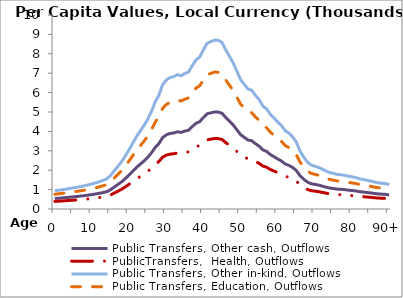
| Category | Public Transfers, Other cash, Outflows | PublicTransfers,  Health, Outflows | Public Transfers, Other in-kind, Outflows | Public Transfers, Education, Outflows |
|---|---|---|---|---|
| 0 | 539.202 | 391.473 | 937.989 | 760.378 |
|  | 555.87 | 403.574 | 966.984 | 783.882 |
| 2 | 572.537 | 415.675 | 995.978 | 807.386 |
| 3 | 589.205 | 427.776 | 1024.973 | 830.891 |
| 4 | 607.193 | 440.836 | 1056.265 | 856.258 |
| 5 | 626.052 | 454.528 | 1089.071 | 882.852 |
| 6 | 646.341 | 469.259 | 1124.367 | 911.464 |
| 7 | 668.012 | 484.992 | 1162.064 | 942.024 |
| 8 | 689.005 | 500.234 | 1198.585 | 971.629 |
| 9 | 714.708 | 518.894 | 1243.296 | 1007.874 |
| 10 | 743.777 | 539.999 | 1293.864 | 1048.867 |
| 11 | 775.064 | 562.715 | 1348.292 | 1092.988 |
| 12 | 810.653 | 588.553 | 1410.201 | 1143.175 |
| 13 | 849.215 | 616.55 | 1477.283 | 1197.554 |
| 14 | 893.287 | 648.547 | 1553.951 | 1259.705 |
| 15 | 995.519 | 722.77 | 1731.791 | 1403.871 |
| 16 | 1130.866 | 821.035 | 1967.24 | 1594.737 |
| 17 | 1266.599 | 919.58 | 2203.359 | 1786.145 |
| 18 | 1404.674 | 1019.826 | 2443.553 | 1980.858 |
| 19 | 1575.683 | 1143.983 | 2741.038 | 2222.013 |
| 20 | 1762.111 | 1279.334 | 3065.345 | 2484.911 |
| 21 | 1954.299 | 1418.866 | 3399.672 | 2755.933 |
| 22 | 2146.965 | 1558.746 | 3734.831 | 3027.629 |
| 23 | 2313.063 | 1679.338 | 4023.774 | 3261.859 |
| 24 | 2475.029 | 1796.929 | 4305.528 | 3490.262 |
| 25 | 2659.846 | 1931.11 | 4627.033 | 3750.889 |
| 26 | 2890.673 | 2098.696 | 5028.577 | 4076.399 |
| 27 | 3167.083 | 2299.376 | 5509.415 | 4466.189 |
| 28 | 3372.315 | 2448.379 | 5866.435 | 4755.606 |
| 29 | 3677.119 | 2669.675 | 6396.669 | 5185.438 |
| 30 | 3821.99 | 2774.854 | 6648.683 | 5389.733 |
| 31 | 3894.075 | 2827.19 | 6774.082 | 5491.387 |
| 32 | 3921.406 | 2847.033 | 6821.627 | 5529.929 |
| 33 | 3981.208 | 2890.45 | 6925.657 | 5614.261 |
| 34 | 3948.17 | 2866.464 | 6868.185 | 5567.672 |
| 35 | 4015.928 | 2915.658 | 6986.056 | 5663.223 |
| 36 | 4059.219 | 2947.088 | 7061.364 | 5724.271 |
| 37 | 4248.507 | 3084.516 | 7390.648 | 5991.204 |
| 38 | 4417.753 | 3207.392 | 7685.065 | 6229.872 |
| 39 | 4505.455 | 3271.066 | 7837.631 | 6353.549 |
| 40 | 4718.758 | 3425.928 | 8208.689 | 6654.346 |
| 41 | 4909.333 | 3564.29 | 8540.211 | 6923.093 |
| 42 | 4958.447 | 3599.948 | 8625.649 | 6992.354 |
| 43 | 5006.084 | 3634.534 | 8708.519 | 7059.532 |
| 44 | 4997.56 | 3628.345 | 8693.69 | 7047.511 |
| 45 | 4933.864 | 3582.1 | 8582.884 | 6957.687 |
| 46 | 4716.661 | 3424.406 | 8205.042 | 6651.39 |
| 47 | 4524.879 | 3285.168 | 7871.421 | 6380.941 |
| 48 | 4330.821 | 3144.277 | 7533.839 | 6107.281 |
| 49 | 4085.381 | 2966.082 | 7106.876 | 5761.165 |
| 50 | 3835.868 | 2784.93 | 6672.825 | 5409.303 |
| 51 | 3692.61 | 2680.921 | 6423.615 | 5207.282 |
| 52 | 3554.542 | 2580.68 | 6183.434 | 5012.58 |
| 53 | 3517.721 | 2553.948 | 6119.382 | 4960.657 |
| 54 | 3366.766 | 2444.351 | 5856.781 | 4747.78 |
| 55 | 3241.811 | 2353.631 | 5639.412 | 4571.571 |
| 56 | 3049.196 | 2213.788 | 5304.342 | 4299.947 |
| 57 | 2966.583 | 2153.809 | 5160.629 | 4183.446 |
| 58 | 2809.626 | 2039.854 | 4887.588 | 3962.107 |
| 59 | 2695.008 | 1956.639 | 4688.2 | 3800.474 |
| 60 | 2579.83 | 1873.017 | 4487.839 | 3638.052 |
| 61 | 2473.639 | 1795.92 | 4303.11 | 3488.302 |
| 62 | 2323.383 | 1686.831 | 4041.727 | 3276.413 |
| 63 | 2247.545 | 1631.77 | 3909.8 | 3169.466 |
| 64 | 2141.401 | 1554.707 | 3725.153 | 3019.783 |
| 65 | 1987.512 | 1442.98 | 3457.45 | 2802.77 |
| 66 | 1717.545 | 1246.978 | 2987.82 | 2422.066 |
| 67 | 1536.536 | 1115.561 | 2672.939 | 2166.809 |
| 68 | 1389.704 | 1008.958 | 2417.511 | 1959.747 |
| 69 | 1301.429 | 944.868 | 2263.948 | 1835.262 |
| 70 | 1267.794 | 920.448 | 2205.437 | 1787.83 |
| 71 | 1231.357 | 893.994 | 2142.053 | 1736.448 |
| 72 | 1178.556 | 855.659 | 2050.2 | 1661.988 |
| 73 | 1125.559 | 817.182 | 1958.008 | 1587.253 |
| 74 | 1079.849 | 783.996 | 1878.491 | 1522.793 |
| 75 | 1055.238 | 766.127 | 1835.677 | 1488.086 |
| 76 | 1025.571 | 744.589 | 1784.071 | 1446.251 |
| 77 | 1016.058 | 737.682 | 1767.522 | 1432.835 |
| 78 | 998.026 | 724.59 | 1736.152 | 1407.406 |
| 79 | 973.721 | 706.944 | 1693.872 | 1373.132 |
| 80 | 952.157 | 691.288 | 1656.359 | 1342.722 |
| 81 | 932.677 | 677.145 | 1622.472 | 1315.252 |
| 82 | 894.659 | 649.544 | 1556.338 | 1261.64 |
| 83 | 874.117 | 634.63 | 1520.603 | 1232.672 |
| 84 | 851.227 | 618.011 | 1480.784 | 1200.392 |
| 85 | 829.711 | 602.39 | 1443.355 | 1170.051 |
| 86 | 799.817 | 580.686 | 1391.35 | 1127.894 |
| 87 | 778.547 | 565.243 | 1354.35 | 1097.899 |
| 88 | 764.9 | 555.335 | 1330.61 | 1078.655 |
| 89 | 754.328 | 547.659 | 1312.218 | 1063.745 |
| 90+ | 722.52 | 524.567 | 1256.887 | 1018.891 |